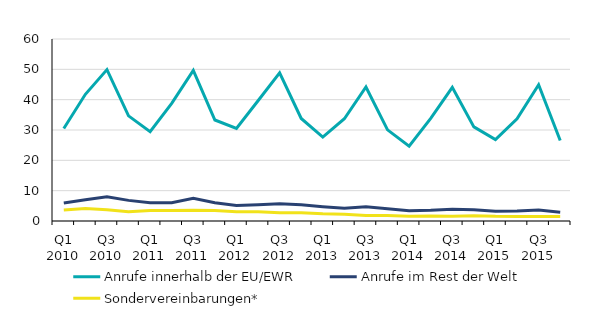
| Category | Anrufe innerhalb der EU/EWR | Anrufe im Rest der Welt | Sondervereinbarungen* |
|---|---|---|---|
| Q1 2010 | 30.508 | 5.951 | 3.611 |
| Q2 2010 | 41.764 | 7.028 | 4.125 |
| Q3 2010 | 49.907 | 8.028 | 3.718 |
| Q4 2010 | 34.666 | 6.797 | 3.031 |
| Q1 2011 | 29.452 | 6.02 | 3.42 |
| Q2 2011 | 38.792 | 6.01 | 3.424 |
| Q3 2011 | 49.654 | 7.503 | 3.53 |
| Q4 2011 | 33.3 | 6.034 | 3.452 |
| Q1 2012 | 30.526 | 5.093 | 3.073 |
| Q2 2012 | 39.654 | 5.384 | 3.058 |
| Q3 2012 | 48.827 | 5.662 | 2.697 |
| Q4 2012 | 33.799 | 5.329 | 2.717 |
| Q1 2013 | 27.65 | 4.721 | 2.378 |
| Q2 2013 | 33.711 | 4.208 | 2.245 |
| Q3 2013 | 44.187 | 4.659 | 1.822 |
| Q4 2013 | 30.051 | 4.056 | 1.796 |
| Q1 2014 | 24.693 | 3.419 | 1.529 |
| Q2 2014 | 33.838 | 3.536 | 1.646 |
| Q3 2014 | 44.076 | 3.854 | 1.569 |
| Q4 2014 | 31.02 | 3.743 | 1.768 |
| Q1 2015 | 26.84 | 3.245 | 1.561 |
| Q2 2015 | 33.673 | 3.292 | 1.522 |
| Q3 2015 | 44.932 | 3.601 | 1.485 |
| Q4 2015 | 26.527 | 2.913 | 1.443 |